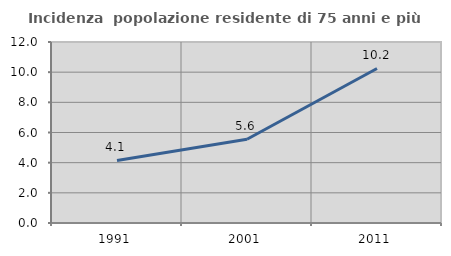
| Category | Incidenza  popolazione residente di 75 anni e più |
|---|---|
| 1991.0 | 4.148 |
| 2001.0 | 5.553 |
| 2011.0 | 10.244 |